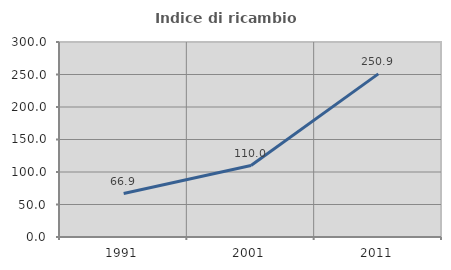
| Category | Indice di ricambio occupazionale  |
|---|---|
| 1991.0 | 66.858 |
| 2001.0 | 109.982 |
| 2011.0 | 250.935 |